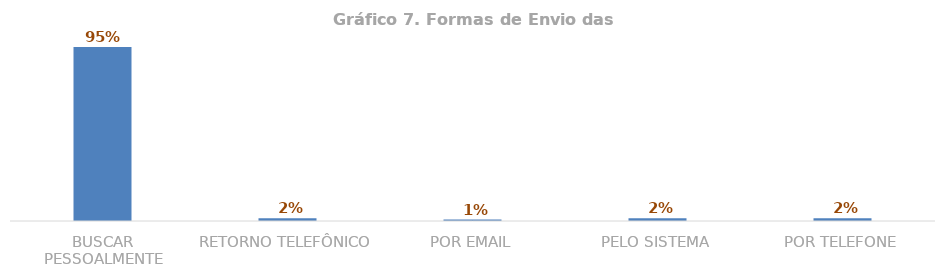
| Category | Total |
|---|---|
| BUSCAR PESSOALMENTE | 0.946 |
| RETORNO TELEFÔNICO | 0.016 |
| POR EMAIL | 0.008 |
| PELO SISTEMA | 0.016 |
| POR TELEFONE | 0.016 |